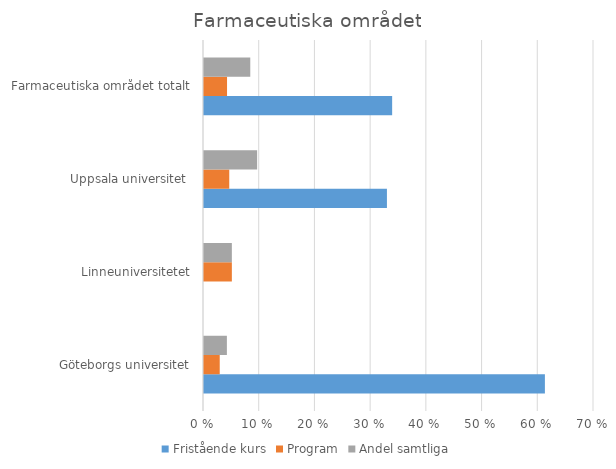
| Category | Fristående kurs | Program | Andel samtliga |
|---|---|---|---|
| Göteborgs universitet | 0.612 | 0.028 | 0.041 |
| Linneuniversitetet | 0 | 0.05 | 0.05 |
| Uppsala universitet  | 0.328 | 0.045 | 0.095 |
| Farmaceutiska området totalt | 0.338 | 0.041 | 0.083 |